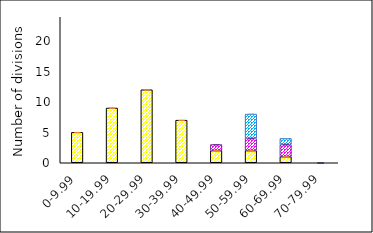
| Category | DTC unc60 | DTC+Sh1 unc60 | Sh1 unc60 |
|---|---|---|---|
| 0-9.99 | 5 | 0 | 0 |
| 10-19.99 | 9 | 0 | 0 |
| 20-29.99 | 12 | 0 | 0 |
| 30-39.99 | 7 | 0 | 0 |
| 40-49.99 | 2 | 1 | 0 |
| 50-59.99 | 2 | 2 | 4 |
| 60-69.99 | 1 | 2 | 1 |
| 70-79.99 | 0 | 0 | 0 |